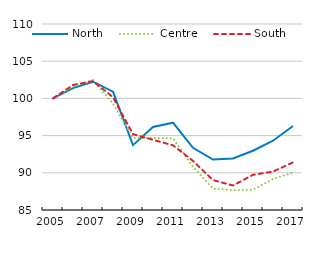
| Category | North | Centre | South |
|---|---|---|---|
| 2005.0 | 100 | 100 | 100 |
| 2006.0 | 101.378 | 101.575 | 101.796 |
| 2007.0 | 102.241 | 102.469 | 102.327 |
| 2008.0 | 100.903 | 99.29 | 100.157 |
| 2009.0 | 93.717 | 94.67 | 95.186 |
| 2010.0 | 96.151 | 94.689 | 94.437 |
| 2011.0 | 96.738 | 94.637 | 93.69 |
| 2012.0 | 93.363 | 90.824 | 91.596 |
| 2013.0 | 91.788 | 87.88 | 89.015 |
| 2014.0 | 91.935 | 87.664 | 88.293 |
| 2015.0 | 92.969 | 87.725 | 89.73 |
| 2016.0 | 94.317 | 89.179 | 90.165 |
| 2017.0 | 96.298 | 90.024 | 91.395 |